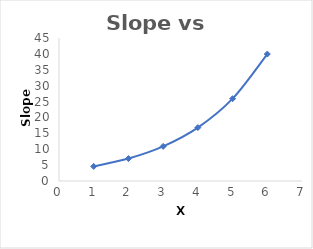
| Category | Series 0 |
|---|---|
| 1.0 | 4.582 |
| 2.0 | 7.065 |
| 3.0 | 10.895 |
| 4.0 | 16.799 |
| 5.0 | 25.905 |
| 6.0 | 39.945 |